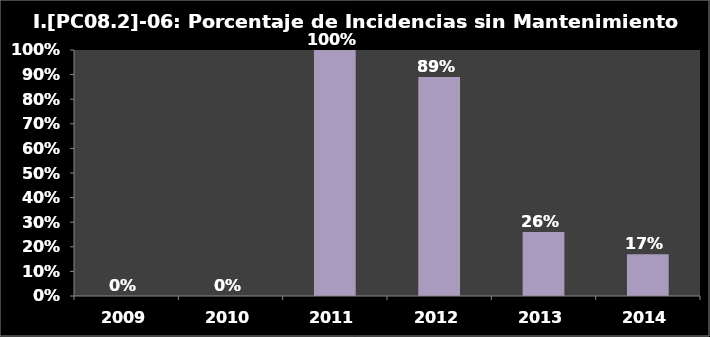
| Category | I.PC08.2-06 |
|---|---|
| 2009.0 | 0 |
| 2010.0 | 0 |
| 2011.0 | 1 |
| 2012.0 | 0.89 |
| 2013.0 | 0.26 |
| 2014.0 | 0.17 |